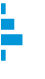
| Category | Series 0 |
|---|---|
| 0 | 0.091 |
| 1 | 0.307 |
| 2 | 0.512 |
| 3 | 0.091 |